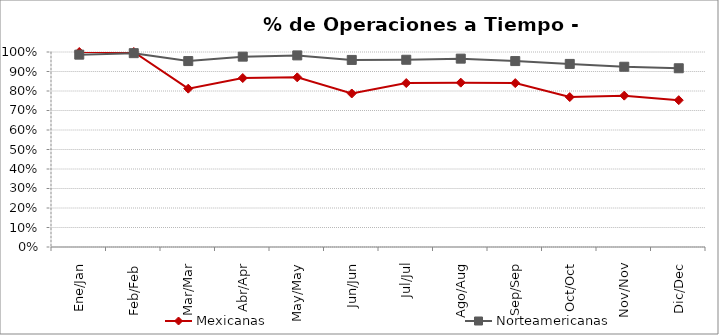
| Category | Mexicanas | Norteamericanas |
|---|---|---|
| Ene/Jan | 1 | 0.986 |
| Feb/Feb | 1 | 0.994 |
| Mar/Mar | 0.812 | 0.953 |
| Abr/Apr | 0.867 | 0.976 |
| May/May | 0.87 | 0.983 |
| Jun/Jun | 0.787 | 0.959 |
| Jul/Jul | 0.841 | 0.96 |
| Ago/Aug | 0.843 | 0.966 |
| Sep/Sep | 0.84 | 0.953 |
| Oct/Oct | 0.769 | 0.939 |
| Nov/Nov | 0.776 | 0.924 |
| Dic/Dec | 0.753 | 0.917 |